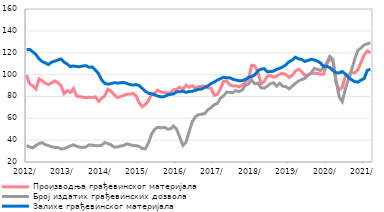
| Category | Производња грађевинског материјала |
|---|---|
| 2012-01-01 | 99.636 |
| 2012-02-01 | 91.132 |
| 2012-03-01 | 89.889 |
| 2012-04-01 | 86.795 |
| 2012-05-01 | 96.019 |
| 2012-06-01 | 94.366 |
| 2012-07-01 | 92.13 |
| 2012-08-01 | 90.86 |
| 2012-09-01 | 92.338 |
| 2012-10-01 | 94.157 |
| 2012-11-01 | 92.776 |
| 2012-12-01 | 89.829 |
| 2013-01-01 | 82.476 |
| 2013-02-01 | 85.356 |
| 2013-03-01 | 83.58 |
| 2013-04-01 | 87.281 |
| 2013-05-01 | 80.436 |
| 2013-06-01 | 79.835 |
| 2013-07-01 | 79.308 |
| 2013-08-01 | 78.858 |
| 2013-09-01 | 79.375 |
| 2013-10-01 | 78.97 |
| 2013-11-01 | 79.785 |
| 2013-12-01 | 75.566 |
| 2014-01-01 | 78.195 |
| 2014-02-01 | 80.37 |
| 2014-03-01 | 86.492 |
| 2014-04-01 | 85.041 |
| 2014-05-01 | 81.733 |
| 2014-06-01 | 79.042 |
| 2014-07-01 | 79.741 |
| 2014-08-01 | 80.945 |
| 2014-09-01 | 81.998 |
| 2014-10-01 | 81.981 |
| 2014-11-01 | 82.919 |
| 2014-12-01 | 80.743 |
| 2015-01-01 | 74.317 |
| 2015-02-01 | 70.592 |
| 2015-03-01 | 72.698 |
| 2015-04-01 | 75.996 |
| 2015-05-01 | 82.008 |
| 2015-06-01 | 82.919 |
| 2015-07-01 | 85.743 |
| 2015-08-01 | 84.063 |
| 2015-09-01 | 83.695 |
| 2015-10-01 | 83.124 |
| 2015-11-01 | 83.299 |
| 2015-12-01 | 86.06 |
| 2016-01-01 | 86.359 |
| 2016-02-01 | 88.422 |
| 2016-03-01 | 86.232 |
| 2016-04-01 | 90.412 |
| 2016-05-01 | 88.424 |
| 2016-06-01 | 89.748 |
| 2016-07-01 | 87.294 |
| 2016-08-01 | 89.032 |
| 2016-09-01 | 89.16 |
| 2016-10-01 | 89.602 |
| 2016-11-01 | 87.844 |
| 2016-12-01 | 87.546 |
| 2017-01-01 | 81.106 |
| 2017-02-01 | 81.676 |
| 2017-03-01 | 86.824 |
| 2017-04-01 | 93.791 |
| 2017-05-01 | 94.222 |
| 2017-06-01 | 90.67 |
| 2017-07-01 | 89.566 |
| 2017-08-01 | 89.712 |
| 2017-09-01 | 88.726 |
| 2017-10-01 | 90.138 |
| 2017-11-01 | 93.074 |
| 2017-12-01 | 95.983 |
| 2018-01-01 | 108.44 |
| 2018-02-01 | 108.008 |
| 2018-03-01 | 102.409 |
| 2018-04-01 | 91.415 |
| 2018-05-01 | 93.457 |
| 2018-06-01 | 98.546 |
| 2018-07-01 | 99.067 |
| 2018-08-01 | 97.619 |
| 2018-09-01 | 98.675 |
| 2018-10-31 | 100.256 |
| 2018-11-30 | 101.149 |
| 2018-12-31 | 99.865 |
| 2019-01-31 | 97.48 |
| 2019-02-28 | 99.162 |
| 2019-03-31 | 103.132 |
| 2019-04-30 | 104.939 |
| 2019-05-31 | 102.719 |
| 2019-06-30 | 99.348 |
| 2019-07-31 | 99.8 |
| 2019-08-31 | 100.974 |
| 2019-09-30 | 101.264 |
| 2019-10-31 | 101.237 |
| 2019-11-30 | 100.196 |
| 2019-12-31 | 100.27 |
| 2020-01-31 | 109.445 |
| 2020-02-29 | 114.132 |
| 2020-03-31 | 111.907 |
| 2020-04-30 | 91.795 |
| 2020-05-31 | 86.193 |
| 2020-06-30 | 88.281 |
| 2020-07-31 | 98.783 |
| 2020-08-31 | 99.84 |
| 2020-09-30 | 101.677 |
| 2020-10-31 | 101.746 |
| 2020-11-30 | 104.386 |
| 2020-12-31 | 111.188 |
| 2021-01-31 | 117.94 |
| 2021-02-28 | 121.599 |
| 2021-03-31 | 119.794 |